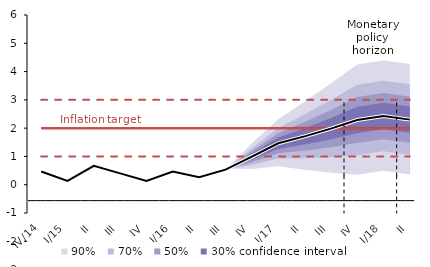
| Category | Inflation Target | Inflation Target - lower bound | Inflation Target - upper bound | linka | Střed předpovědi |
|---|---|---|---|---|---|
| IV/14 | 2 | 1 | 3 | 0.467 | 0.467 |
| I/15 | 2 | 1 | 3 | 0.133 | 0.133 |
| II | 2 | 1 | 3 | 0.667 | 0.667 |
| III | 2 | 1 | 3 | 0.4 | 0.4 |
| IV | 2 | 1 | 3 | 0.133 | 0.133 |
| I/16 | 2 | 1 | 3 | 0.467 | 0.467 |
| II | 2 | 1 | 3 | 0.267 | 0.267 |
| III | 2 | 1 | 3 | 0.533 | 0.533 |
| IV | 2 | 1 | 3 | 0.993 | 0.993 |
| I/17 | 2 | 1 | 3 | 1.465 | 1.465 |
| II | 2 | 1 | 3 | 1.71 | 1.71 |
| III | 2 | 1 | 3 | 1.981 | 1.981 |
| IV | 2 | 1 | 3 | 2.286 | 2.286 |
| I/18 | 2 | 1 | 3 | 2.428 | 2.428 |
| II | 2 | 1 | 3 | 2.301 | 2.301 |